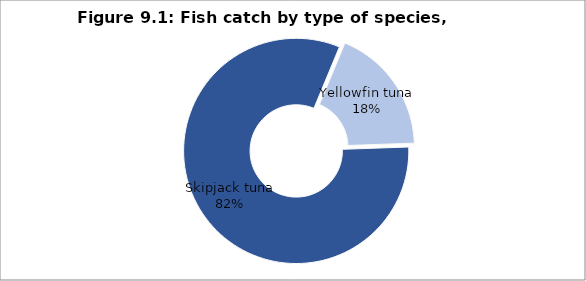
| Category | Series 0 |
|---|---|
| Skipjack tuna | 126385.8 |
| Yellowfin tuna | 28082.963 |